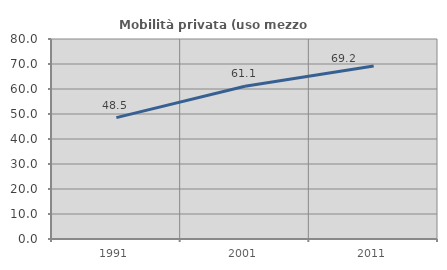
| Category | Mobilità privata (uso mezzo privato) |
|---|---|
| 1991.0 | 48.533 |
| 2001.0 | 61.094 |
| 2011.0 | 69.208 |